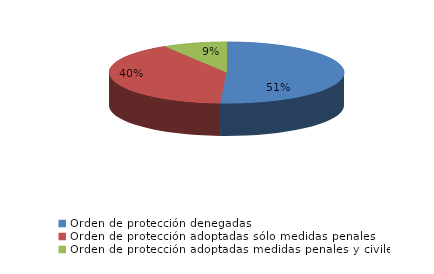
| Category | Series 0 |
|---|---|
| Orden de protección denegadas | 452 |
| Orden de protección adoptadas sólo medidas penales | 359 |
| Orden de protección adoptadas medidas penales y civiles | 78 |